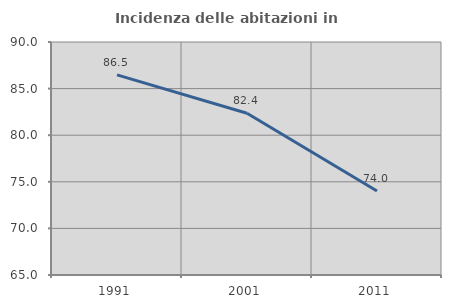
| Category | Incidenza delle abitazioni in proprietà  |
|---|---|
| 1991.0 | 86.473 |
| 2001.0 | 82.353 |
| 2011.0 | 74.02 |